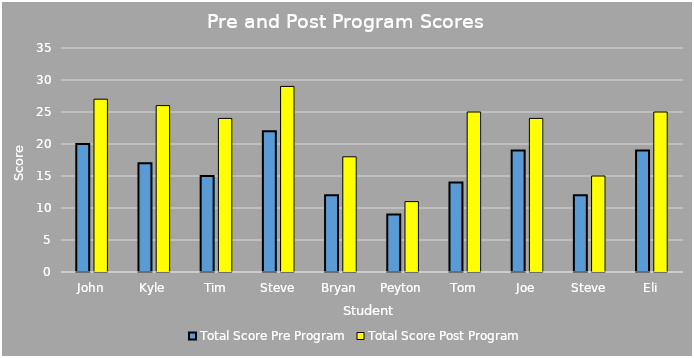
| Category | Total Score Pre Program | Total Score Post Program  |
|---|---|---|
| John | 20 | 27 |
| Kyle | 17 | 26 |
| Tim | 15 | 24 |
| Steve | 22 | 29 |
| Bryan | 12 | 18 |
| Peyton | 9 | 11 |
| Tom | 14 | 25 |
| Joe | 19 | 24 |
| Steve | 12 | 15 |
| Eli | 19 | 25 |